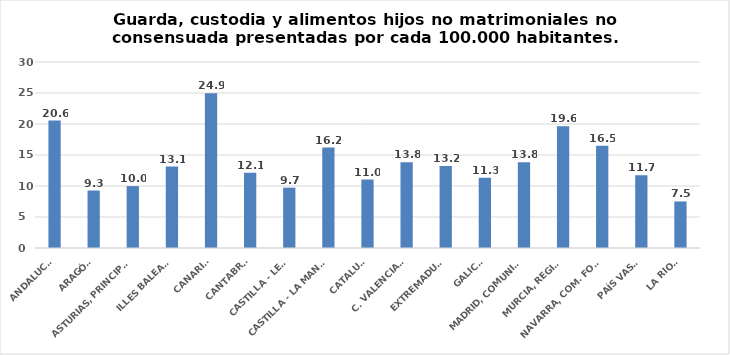
| Category | Series 0 |
|---|---|
| ANDALUCÍA | 20.55 |
| ARAGÓN | 9.274 |
| ASTURIAS, PRINCIPADO | 9.982 |
| ILLES BALEARS | 13.129 |
| CANARIAS | 24.943 |
| CANTABRIA | 12.147 |
| CASTILLA - LEÓN | 9.735 |
| CASTILLA - LA MANCHA | 16.199 |
| CATALUÑA | 11.039 |
| C. VALENCIANA | 13.839 |
| EXTREMADURA | 13.214 |
| GALICIA | 11.315 |
| MADRID, COMUNIDAD | 13.834 |
| MURCIA, REGIÓN | 19.625 |
| NAVARRA, COM. FORAL | 16.477 |
| PAÍS VASCO | 11.743 |
| LA RIOJA | 7.505 |